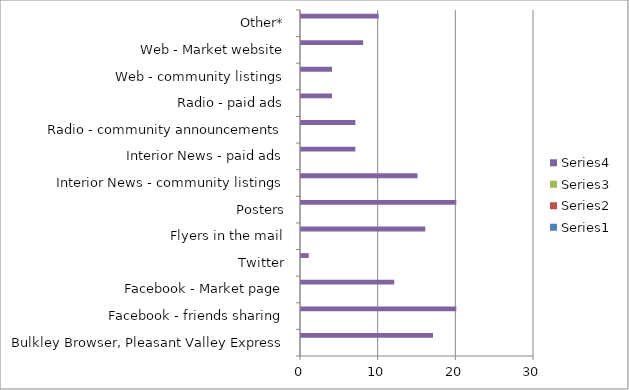
| Category | Series 0 | Series 1 | Series 2 | Series 3 |
|---|---|---|---|---|
| Bulkley Browser, Pleasant Valley Express |  |  |  | 17 |
| Facebook - friends sharing |  |  |  | 20 |
| Facebook - Market page |  |  |  | 12 |
| Twitter |  |  |  | 1 |
| Flyers in the mail |  |  |  | 16 |
| Posters |  |  |  | 20 |
| Interior News - community listings |  |  |  | 15 |
| Interior News - paid ads |  |  |  | 7 |
| Radio - community announcements |  |  |  | 7 |
| Radio - paid ads |  |  |  | 4 |
| Web - community listings |  |  |  | 4 |
| Web - Market website |  |  |  | 8 |
| Other* |  |  |  | 10 |